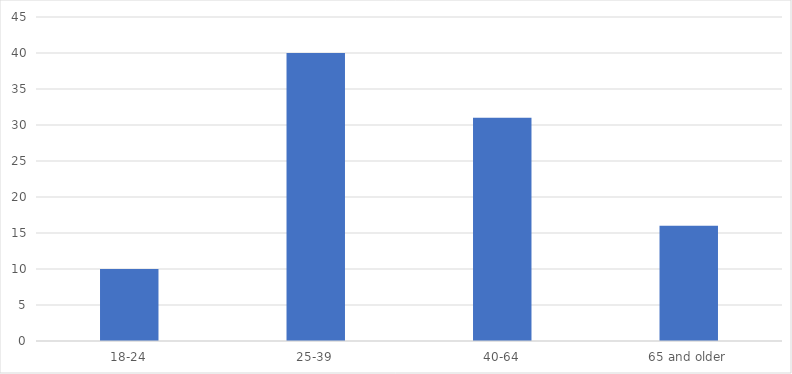
| Category | Number of Responses |
|---|---|
| 18-24 | 10 |
| 25-39 | 40 |
| 40-64 | 31 |
| 65 and older | 16 |